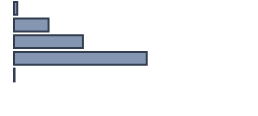
| Category | Percentatge |
|---|---|
| 0 | 1.364 |
| 1 | 14.394 |
| 2 | 28.712 |
| 3 | 55.303 |
| 4 | 0.227 |
| 5 | 0 |